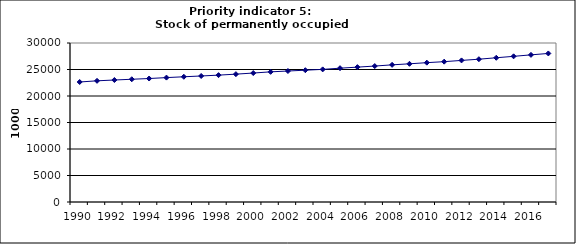
| Category | Stock of permanently occupied dwellings, 1000 |
|---|---|
| 1990 | 22643.922 |
| 1991 | 22862.734 |
| 1992 | 23016.502 |
| 1993 | 23159.711 |
| 1994 | 23298.46 |
| 1995 | 23470.105 |
| 1996 | 23627.609 |
| 1997 | 23777.987 |
| 1998 | 23937.522 |
| 1999 | 24122.857 |
| 2000 | 24333.192 |
| 2001 | 24557.508 |
| 2002 | 24714.518 |
| 2003 | 24867.87 |
| 2004 | 25022.034 |
| 2005 | 25249.505 |
| 2006 | 25445.964 |
| 2007 | 25650.572 |
| 2008 | 25875.694 |
| 2009 | 26075.474 |
| 2010 | 26288.643 |
| 2011 | 26477.045 |
| 2012 | 26714.454 |
| 2013 | 26944.184 |
| 2014 | 27214.168 |
| 2015 | 27484.27 |
| 2016 | 27761.889 |
| 2017 | 28029.823 |